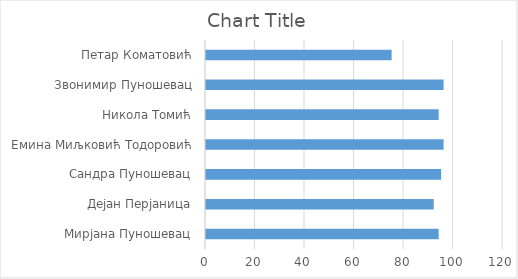
| Category | Series 0 |
|---|---|
| Мирјана Пуношевац | 94 |
| Дејан Перјаница | 92 |
| Сандра Пуношевац | 95 |
| Емина Миљковић Тодоровић | 96 |
| Никола Томић | 94 |
| Звонимир Пуношевац | 96 |
| Петар Коматовић | 75 |